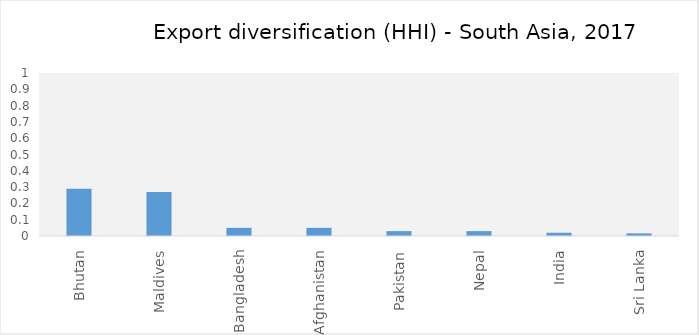
| Category | Series 0 |
|---|---|
| Bhutan | 0.29 |
| Maldives | 0.27 |
| Bangladesh | 0.05 |
| Afghanistan | 0.05 |
| Pakistan | 0.03 |
| Nepal | 0.03 |
| India | 0.02 |
| Sri Lanka | 0.016 |